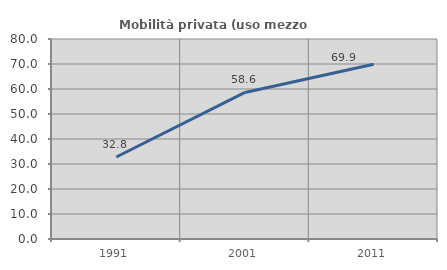
| Category | Mobilità privata (uso mezzo privato) |
|---|---|
| 1991.0 | 32.787 |
| 2001.0 | 58.626 |
| 2011.0 | 69.878 |